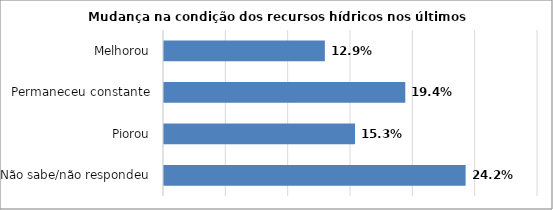
| Category | Series 0 |
|---|---|
| Não sabe/não respondeu | 0.242 |
| Piorou | 0.153 |
| Permaneceu constante | 0.194 |
| Melhorou | 0.129 |